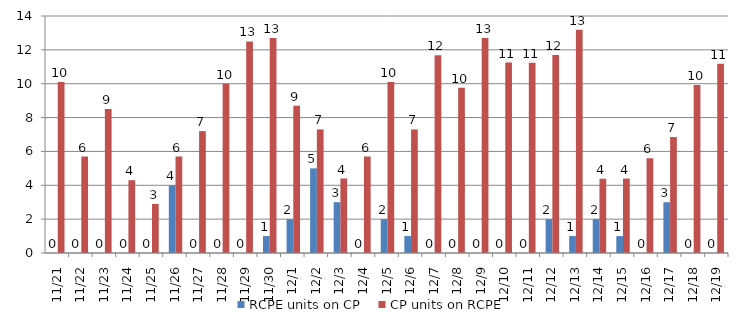
| Category | RCPE units on CP | CP units on RCPE |
|---|---|---|
| 2015-11-21 | 0 | 10.1 |
| 2015-11-22 | 0 | 5.7 |
| 2015-11-23 | 0 | 8.5 |
| 2015-11-24 | 0 | 4.3 |
| 2015-11-25 | 0 | 2.9 |
| 2015-11-26 | 4 | 5.7 |
| 2015-11-27 | 0 | 7.2 |
| 2015-11-28 | 0 | 10 |
| 2015-11-29 | 0 | 12.5 |
| 2015-11-30 | 1 | 12.7 |
| 2015-12-01 | 2 | 8.7 |
| 2015-12-02 | 5 | 7.3 |
| 2015-12-03 | 3 | 4.4 |
| 2015-12-04 | 0 | 5.7 |
| 2015-12-05 | 2 | 10.1 |
| 2015-12-06 | 1 | 7.3 |
| 2015-12-07 | 0 | 11.68 |
| 2015-12-08 | 0 | 9.76 |
| 2015-12-09 | 0 | 12.697 |
| 2015-12-10 | 0 | 11.25 |
| 2015-12-11 | 0 | 11.237 |
| 2015-12-12 | 2 | 11.703 |
| 2015-12-13 | 1 | 13.183 |
| 2015-12-14 | 2 | 4.387 |
| 2015-12-15 | 1 | 4.397 |
| 2015-12-16 | 0 | 5.597 |
| 2015-12-17 | 3 | 6.85 |
| 2015-12-18 | 0 | 9.92 |
| 2015-12-19 | 0 | 11.187 |